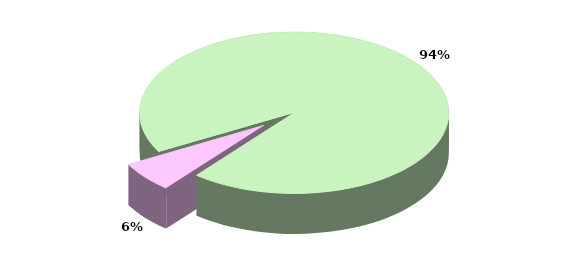
| Category | Series 0 |
|---|---|
| TOTALE ENTRATE CORRENTI | 22066.241 |
| TOTALE ENTRATE IN CONTO CAPITALE | 1425.441 |